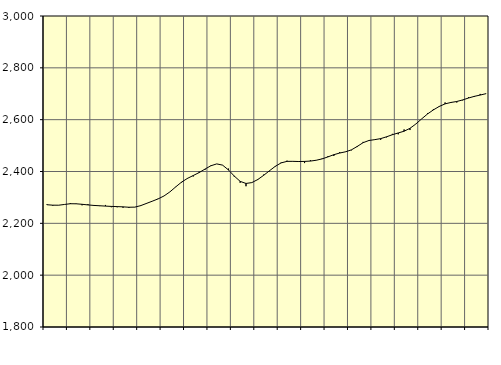
| Category | Piggar | Series 1 |
|---|---|---|
| nan | 2273.8 | 2271.77 |
| 1.0 | 2267.9 | 2270.03 |
| 1.0 | 2269.6 | 2269.9 |
| 1.0 | 2273.1 | 2272.82 |
| nan | 2278.4 | 2275.63 |
| 2.0 | 2276.4 | 2275.38 |
| 2.0 | 2269.6 | 2273.46 |
| 2.0 | 2274.4 | 2271.05 |
| nan | 2267.1 | 2269.06 |
| 3.0 | 2266.6 | 2267.84 |
| 3.0 | 2270.9 | 2266.48 |
| 3.0 | 2262.2 | 2265.31 |
| nan | 2262 | 2264.55 |
| 4.0 | 2260.1 | 2263.58 |
| 4.0 | 2259.2 | 2262.07 |
| 4.0 | 2262.1 | 2262.53 |
| nan | 2269.7 | 2268.18 |
| 5.0 | 2278.4 | 2276.81 |
| 5.0 | 2285.1 | 2285.49 |
| 5.0 | 2295.4 | 2294.43 |
| nan | 2305.7 | 2305.68 |
| 6.0 | 2321.4 | 2321.31 |
| 6.0 | 2339.8 | 2340.73 |
| 6.0 | 2357.2 | 2359.17 |
| nan | 2374.8 | 2373.47 |
| 7.0 | 2380.9 | 2384.58 |
| 7.0 | 2399.4 | 2395.91 |
| 7.0 | 2406.8 | 2409.35 |
| nan | 2423.3 | 2422.09 |
| 8.0 | 2429.3 | 2429.31 |
| 8.0 | 2424.2 | 2424.59 |
| 8.0 | 2411.2 | 2406.08 |
| nan | 2379.9 | 2382.31 |
| 9.0 | 2356.6 | 2362 |
| 9.0 | 2343.1 | 2353.82 |
| 9.0 | 2357.2 | 2357.24 |
| nan | 2367.1 | 2368.87 |
| 10.0 | 2387.9 | 2384.96 |
| 10.0 | 2400.6 | 2402.68 |
| 10.0 | 2418.4 | 2419.98 |
| nan | 2434.7 | 2433.2 |
| 11.0 | 2441.8 | 2439.12 |
| 11.0 | 2438.9 | 2439.17 |
| 11.0 | 2436.8 | 2438.5 |
| nan | 2432.5 | 2438.92 |
| 12.0 | 2443.4 | 2440.23 |
| 12.0 | 2443 | 2443.45 |
| 12.0 | 2450.1 | 2448.75 |
| nan | 2459.3 | 2456.4 |
| 13.0 | 2460 | 2464.92 |
| 13.0 | 2474.8 | 2471.25 |
| 13.0 | 2476.6 | 2475.98 |
| nan | 2481.7 | 2483.49 |
| 14.0 | 2494.4 | 2496.74 |
| 14.0 | 2514.3 | 2511.21 |
| 14.0 | 2520.9 | 2519.71 |
| nan | 2522.4 | 2522.97 |
| 15.0 | 2522.3 | 2526.86 |
| 15.0 | 2531.8 | 2533.85 |
| 15.0 | 2545.2 | 2541.95 |
| nan | 2543.5 | 2548.74 |
| 16.0 | 2562.2 | 2555.44 |
| 16.0 | 2560 | 2566.53 |
| 16.0 | 2583.5 | 2583.12 |
| nan | 2603.2 | 2603.1 |
| 17.0 | 2624.7 | 2621.94 |
| 17.0 | 2640.8 | 2637.7 |
| 17.0 | 2649.4 | 2651 |
| nan | 2666.3 | 2660.99 |
| 18.0 | 2664.9 | 2666.39 |
| 18.0 | 2666.2 | 2670.15 |
| 18.0 | 2674.5 | 2676.16 |
| nan | 2686.6 | 2683.5 |
| 19.0 | 2687.6 | 2689.95 |
| 19.0 | 2699.3 | 2694.96 |
| 19.0 | 2699.8 | 2700.38 |